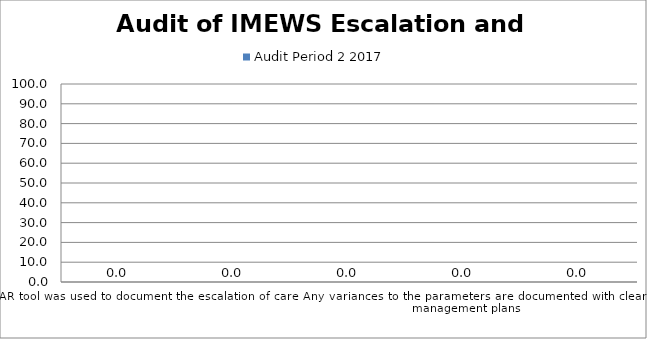
| Category | Audit Period 2 2017 |
|---|---|
| The ISBAR tool was used to document the escalation of care | 0 |
| There is evidence of an increase in the frequency of monitoring and recording of vital signs in response to the detection of observations in the yellow or pink zones | 0 |
| Measures implemented to reduce triggers as appropriate | 0 |
| Any variances to the parameters are documented with clear management plans | 0 |
| Medical review documented by the doctor | 0 |